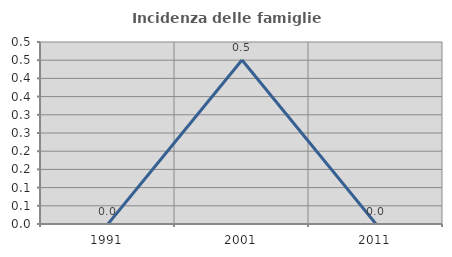
| Category | Incidenza delle famiglie numerose |
|---|---|
| 1991.0 | 0 |
| 2001.0 | 0.45 |
| 2011.0 | 0 |